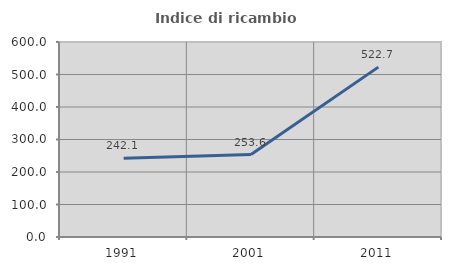
| Category | Indice di ricambio occupazionale  |
|---|---|
| 1991.0 | 242.105 |
| 2001.0 | 253.571 |
| 2011.0 | 522.727 |